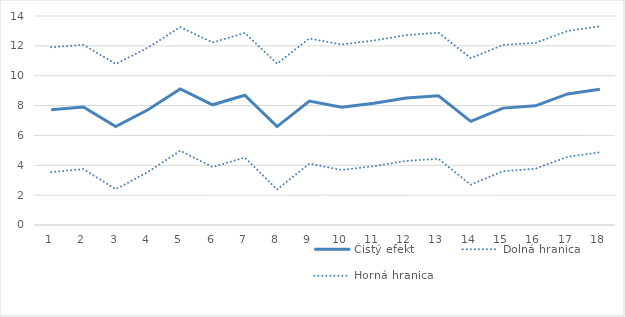
| Category | Čistý efekt | Dolná hranica | Horná hranica |
|---|---|---|---|
| 1.0 | 7.725 | 3.547 | 11.904 |
| 2.0 | 7.907 | 3.743 | 12.071 |
| 3.0 | 6.59 | 2.396 | 10.784 |
| 4.0 | 7.718 | 3.554 | 11.882 |
| 5.0 | 9.117 | 4.977 | 13.257 |
| 6.0 | 8.053 | 3.88 | 12.226 |
| 7.0 | 8.692 | 4.521 | 12.863 |
| 8.0 | 6.594 | 2.379 | 10.808 |
| 9.0 | 8.3 | 4.11 | 12.491 |
| 10.0 | 7.889 | 3.686 | 12.092 |
| 11.0 | 8.15 | 3.942 | 12.358 |
| 12.0 | 8.508 | 4.295 | 12.721 |
| 13.0 | 8.658 | 4.437 | 12.88 |
| 14.0 | 6.94 | 2.701 | 11.18 |
| 15.0 | 7.829 | 3.599 | 12.059 |
| 16.0 | 7.983 | 3.77 | 12.195 |
| 17.0 | 8.782 | 4.569 | 12.995 |
| 18.0 | 9.091 | 4.871 | 13.311 |